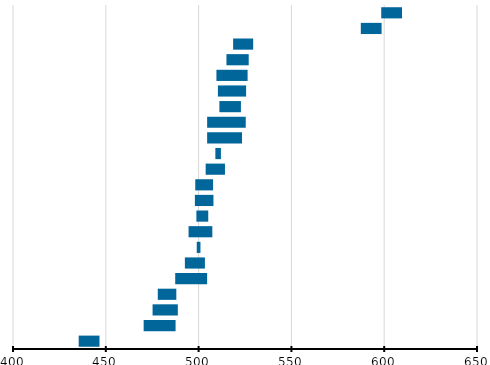
| Category | Series 0 | Series 1 |
|---|---|---|
| Corée du Sud | 598.4 | 11.2 |
| Japon | 587.4 | 11.2 |
| Irlande | 518.6 | 10.8 |
| Lituanie | 515 | 12 |
| Israël | 509.6 | 16.8 |
| Australie | 510.4 | 15.2 |
| Hongrie | 511.2 | 11.6 |
| États-Unis | 504.6 | 20.8 |
| Angleterre | 504.6 | 18.8 |
| Moyenne Internationale (UE et/ou OCDE) | 509.029 | 2.989 |
| Finlande | 503.8 | 10.4 |
| Norvège* | 498.2 | 9.6 |
| Suède | 498 | 10 |
| Chypre | 498.8 | 6.4 |
| Portugal | 494.6 | 12.8 |
| Centre de l'échelle TIMSS | 499 | 2 |
| Italie | 492.6 | 10.8 |
| Turquie | 487.4 | 17.2 |
| France | 478 | 10 |
| Nouvelle-Zélande | 475.2 | 13.6 |
| Roumanie | 470.4 | 17.2 |
| Chili | 435.4 | 11.2 |